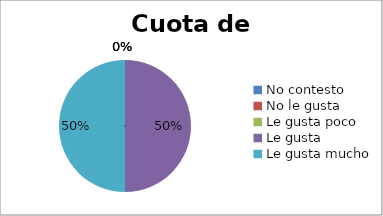
| Category | Series 0 |
|---|---|
| No contesto | 0 |
| No le gusta | 0 |
| Le gusta poco | 0 |
| Le gusta | 3 |
| Le gusta mucho | 3 |